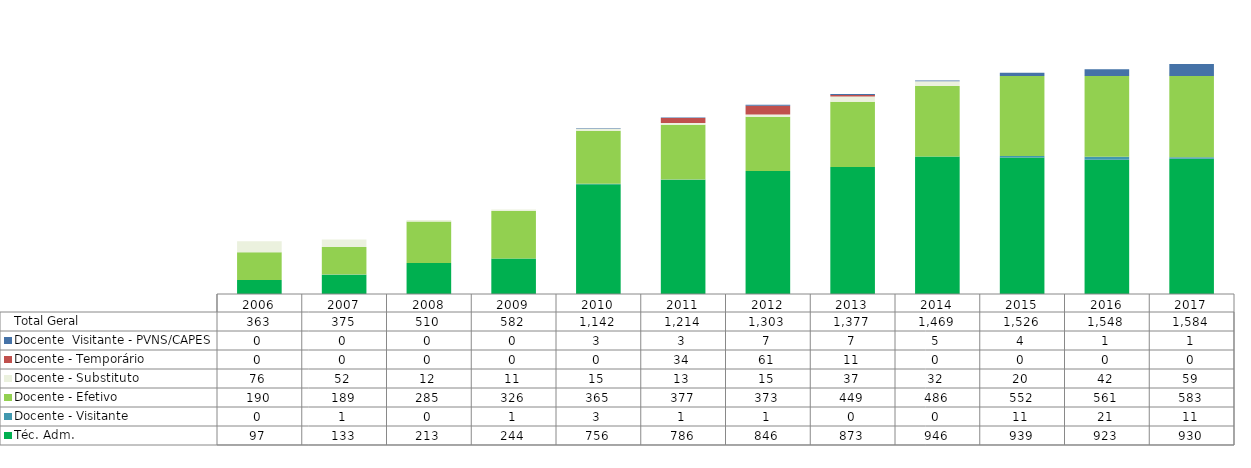
| Category | Téc. Adm. | Docente - Visitante | Docente - Efetivo | Docente - Substituto | Docente - Temporário | Docente  Visitante - PVNS/CAPES  | Total Geral |
|---|---|---|---|---|---|---|---|
| 2006.0 | 97 | 0 | 190 | 76 | 0 | 0 | 363 |
| 2007.0 | 133 | 1 | 189 | 52 | 0 | 0 | 375 |
| 2008.0 | 213 | 0 | 285 | 12 | 0 | 0 | 510 |
| 2009.0 | 244 | 1 | 326 | 11 | 0 | 0 | 582 |
| 2010.0 | 756 | 3 | 365 | 15 | 0 | 3 | 1142 |
| 2011.0 | 786 | 1 | 377 | 13 | 34 | 3 | 1214 |
| 2012.0 | 846 | 1 | 373 | 15 | 61 | 7 | 1303 |
| 2013.0 | 873 | 0 | 449 | 37 | 11 | 7 | 1377 |
| 2014.0 | 946 | 0 | 486 | 32 | 0 | 5 | 1469 |
| 2015.0 | 939 | 11 | 552 | 20 | 0 | 4 | 1526 |
| 2016.0 | 923 | 21 | 561 | 42 | 0 | 1 | 1548 |
| 2017.0 | 930 | 11 | 583 | 59 | 0 | 1 | 1584 |